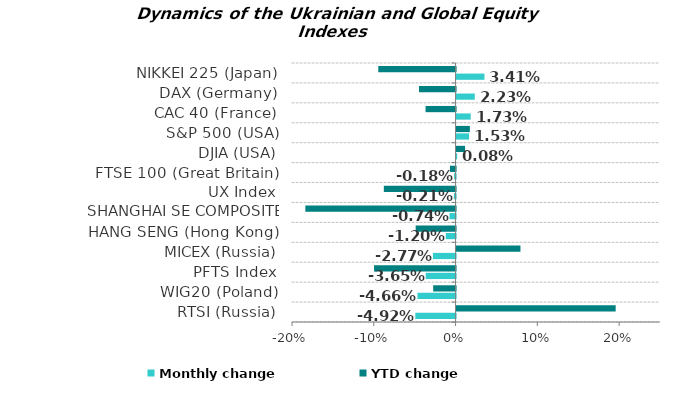
| Category | Monthly change | YTD change |
|---|---|---|
| RTSI (Russia) | -0.049 | 0.195 |
| WIG20 (Poland) | -0.047 | -0.027 |
| PFTS Index | -0.036 | -0.1 |
| MICEX (Russia) | -0.028 | 0.078 |
| HANG SENG (Hong Kong) | -0.012 | -0.049 |
| SHANGHAI SE COMPOSITE (China) | -0.007 | -0.184 |
| UX Index | -0.002 | -0.088 |
| FTSE 100 (Great Britain) | -0.002 | -0.007 |
| DJIA (USA) | 0.001 | 0.01 |
| S&P 500 (USA) | 0.015 | 0.016 |
| CAC 40 (France) | 0.017 | -0.037 |
| DAX (Germany) | 0.022 | -0.045 |
| NIKKEI 225 (Japan) | 0.034 | -0.095 |